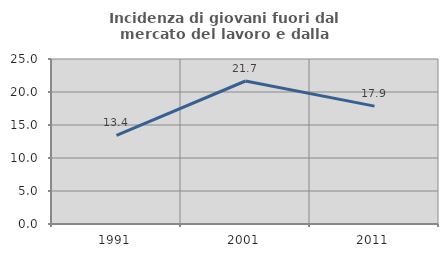
| Category | Incidenza di giovani fuori dal mercato del lavoro e dalla formazione  |
|---|---|
| 1991.0 | 13.427 |
| 2001.0 | 21.667 |
| 2011.0 | 17.857 |